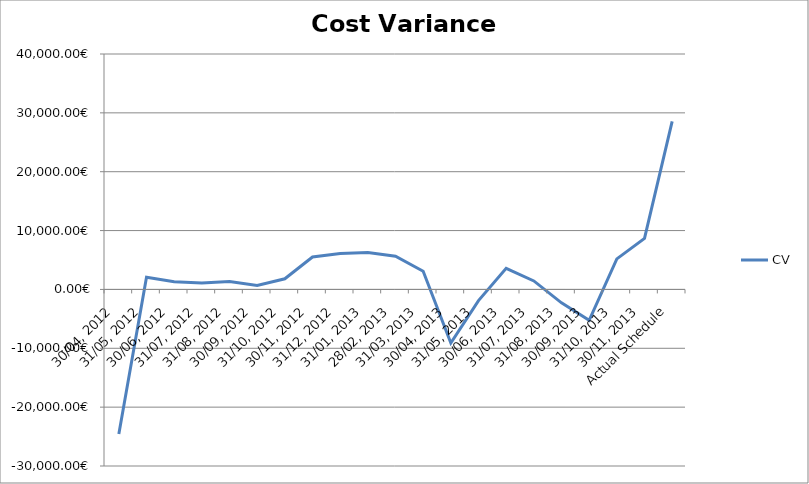
| Category | CV |
|---|---|
| 30/04, 2012 | -24568.866 |
| 31/05, 2012 | 2055.422 |
| 30/06, 2012 | 1304.77 |
| 31/07, 2012 | 1104.47 |
| 31/08, 2012 | 1357.419 |
| 30/09, 2012 | 690.463 |
| 31/10, 2012 | 1808.322 |
| 30/11, 2012 | 5505.596 |
| 31/12, 2012 | 6093.224 |
| 31/01, 2013 | 6265.556 |
| 28/02, 2013 | 5639.271 |
| 31/03, 2013 | 3080.194 |
| 30/04, 2013 | -9100.962 |
| 31/05, 2013 | -1897.114 |
| 30/06, 2013 | 3584.48 |
| 31/07, 2013 | 1444.831 |
| 31/08, 2013 | -2278.466 |
| 30/09, 2013 | -5239.967 |
| 31/10, 2013 | 5185.363 |
| 30/11, 2013 | 8667.24 |
| Actual Schedule | 28537.48 |